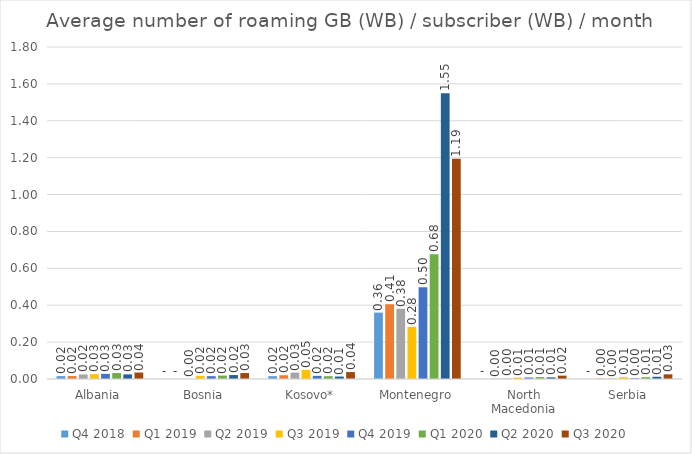
| Category | Q4 2018 | Q1 2019 | Q2 2019 | Q3 2019 | Q4 2019 | Q1 2020 | Q2 2020 | Q3 2020 |
|---|---|---|---|---|---|---|---|---|
| Albania | 0.016 | 0.016 | 0.025 | 0.026 | 0.028 | 0.032 | 0.025 | 0.035 |
| Bosnia | 0 | 0 | 0 | 0.017 | 0.015 | 0.019 | 0.021 | 0.032 |
| Kosovo* | 0.015 | 0.02 | 0.035 | 0.049 | 0.017 | 0.015 | 0.013 | 0.038 |
| Montenegro | 0.36 | 0.405 | 0.381 | 0.283 | 0.497 | 0.676 | 1.549 | 1.194 |
| North Macedonia | 0 | 0.002 | 0.003 | 0.008 | 0.008 | 0.01 | 0.009 | 0.018 |
| Serbia | 0 | 0.003 | 0.002 | 0.009 | 0.004 | 0.01 | 0.012 | 0.025 |